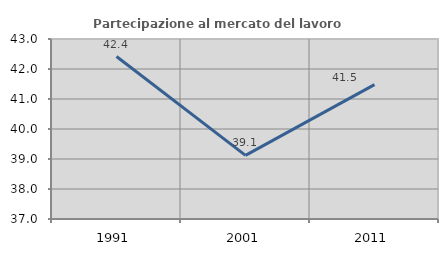
| Category | Partecipazione al mercato del lavoro  femminile |
|---|---|
| 1991.0 | 42.416 |
| 2001.0 | 39.122 |
| 2011.0 | 41.48 |